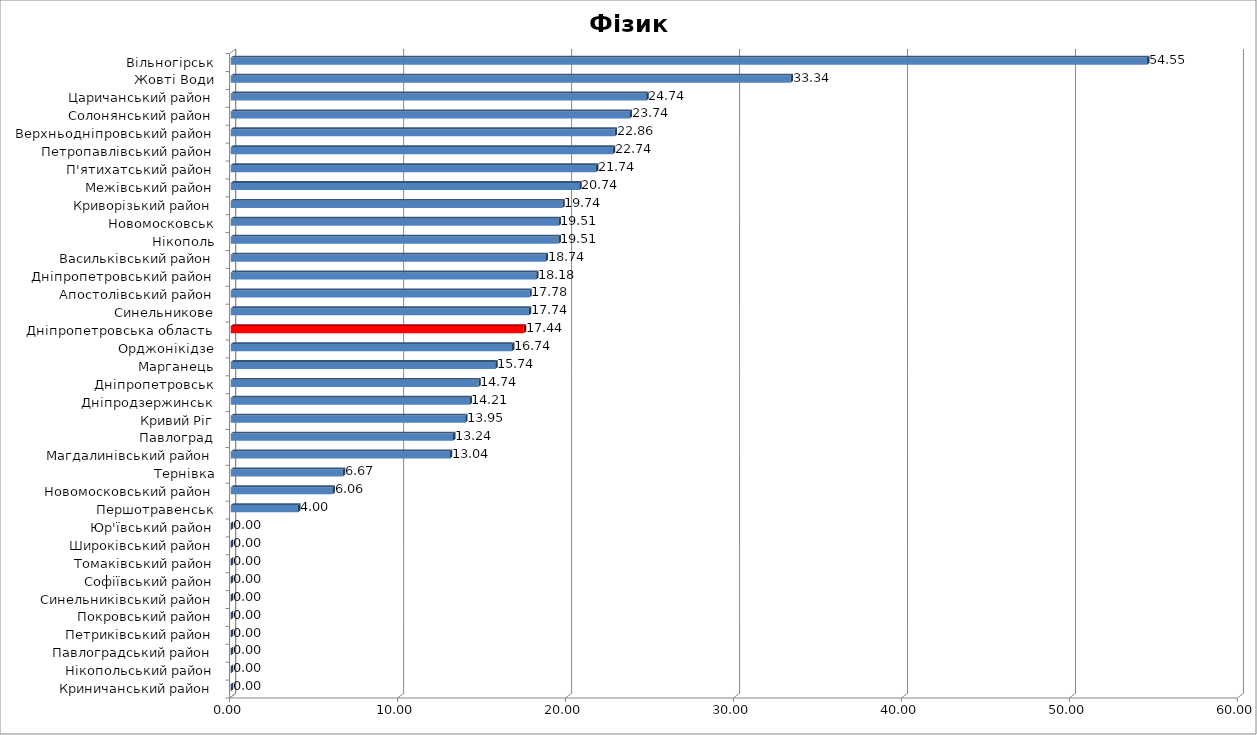
| Category | [160;200] |
|---|---|
| Криничанський район | 0 |
| Нікопольський район | 0 |
| Павлоградський район | 0 |
| Петриківський район | 0 |
| Покровський район | 0 |
| Синельниківський район | 0 |
| Софіївський район | 0 |
| Томаківський район | 0 |
| Широківський район | 0 |
| Юр'ївський район | 0 |
| Першотравенськ | 4.001 |
| Новомосковський район | 6.06 |
| Тернівка | 6.666 |
| Магдалинівський район | 13.043 |
| Павлоград | 13.236 |
| Кривий Ріг | 13.953 |
| Дніпродзержинськ | 14.211 |
| Дніпропетровськ | 14.743 |
| Марганець | 15.743 |
| Орджонікідзе | 16.743 |
| Дніпропетровська область | 17.439 |
| Синельникове | 17.743 |
| Апостолівський район | 17.778 |
| Дніпропетровський район | 18.182 |
| Васильківський район | 18.743 |
| Нікополь | 19.511 |
| Новомосковськ | 19.512 |
| Криворізький район | 19.743 |
| Межівський район | 20.743 |
| П'ятихатський район | 21.743 |
| Петропавлівський район | 22.743 |
| Верхньодніпровський район | 22.856 |
| Солонянський район | 23.743 |
| Царичанський район | 24.743 |
| Жовті Води | 33.335 |
| Вільногірськ | 54.547 |